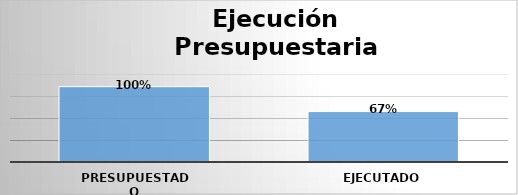
| Category | Series 0 |
|---|---|
| Presupuestado | 6846942708 |
| Ejecutado | 4586203234 |